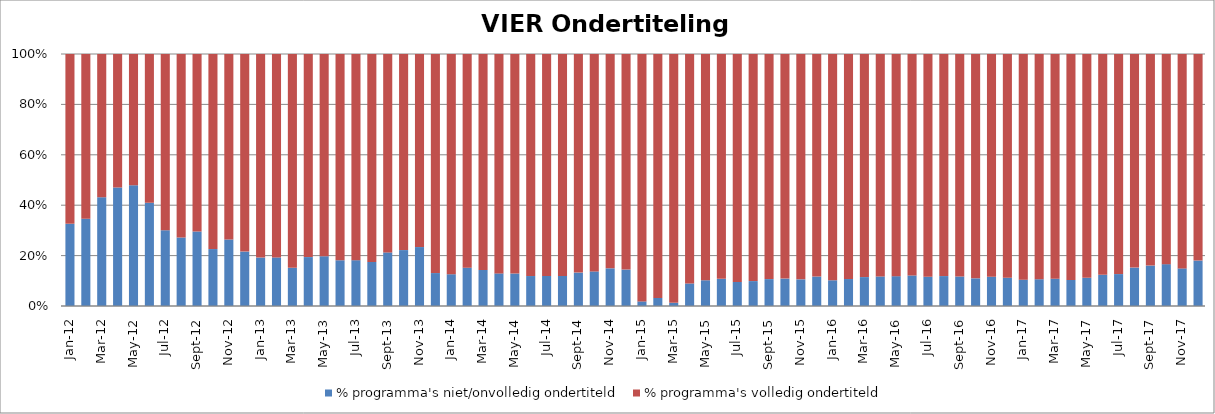
| Category | % programma's niet/onvolledig ondertiteld | % programma's volledig ondertiteld |
|---|---|---|
| 2012-01-01 | 0.326 | 0.674 |
| 2012-02-01 | 0.347 | 0.653 |
| 2012-03-01 | 0.432 | 0.568 |
| 2012-04-01 | 0.47 | 0.53 |
| 2012-05-01 | 0.48 | 0.52 |
| 2012-06-01 | 0.41 | 0.59 |
| 2012-07-01 | 0.301 | 0.699 |
| 2012-08-01 | 0.272 | 0.728 |
| 2012-09-01 | 0.296 | 0.704 |
| 2012-10-01 | 0.226 | 0.774 |
| 2012-11-01 | 0.264 | 0.736 |
| 2012-12-01 | 0.216 | 0.784 |
| 2013-01-01 | 0.192 | 0.808 |
| 2013-02-01 | 0.193 | 0.807 |
| 2013-03-01 | 0.151 | 0.849 |
| 2013-04-01 | 0.194 | 0.806 |
| 2013-05-01 | 0.197 | 0.803 |
| 2013-06-01 | 0.182 | 0.818 |
| 2013-07-01 | 0.182 | 0.818 |
| 2013-08-01 | 0.175 | 0.825 |
| 2013-09-01 | 0.213 | 0.787 |
| 2013-10-01 | 0.222 | 0.778 |
| 2013-11-01 | 0.234 | 0.766 |
| 2013-12-01 | 0.131 | 0.869 |
| 2014-01-01 | 0.126 | 0.874 |
| 2014-02-01 | 0.152 | 0.848 |
| 2014-03-01 | 0.143 | 0.857 |
| 2014-04-01 | 0.129 | 0.871 |
| 2014-05-01 | 0.129 | 0.871 |
| 2014-06-01 | 0.119 | 0.881 |
| 2014-07-01 | 0.12 | 0.88 |
| 2014-08-01 | 0.119 | 0.881 |
| 2014-09-01 | 0.132 | 0.868 |
| 2014-10-01 | 0.137 | 0.863 |
| 2014-11-01 | 0.15 | 0.85 |
| 2014-12-01 | 0.145 | 0.855 |
| 2015-01-01 | 0.018 | 0.982 |
| 2015-02-01 | 0.032 | 0.968 |
| 2015-03-01 | 0.012 | 0.988 |
| 2015-04-01 | 0.089 | 0.911 |
| 2015-05-01 | 0.102 | 0.898 |
| 2015-06-01 | 0.108 | 0.892 |
| 2015-07-01 | 0.095 | 0.905 |
| 2015-08-01 | 0.099 | 0.901 |
| 2015-09-01 | 0.107 | 0.893 |
| 2015-10-01 | 0.109 | 0.891 |
| 2015-11-01 | 0.106 | 0.894 |
| 2015-12-01 | 0.117 | 0.883 |
| 2016-01-01 | 0.102 | 0.898 |
| 2016-02-01 | 0.107 | 0.893 |
| 2016-03-01 | 0.115 | 0.885 |
| 2016-04-01 | 0.117 | 0.883 |
| 2016-05-01 | 0.118 | 0.882 |
| 2016-06-01 | 0.121 | 0.879 |
| 2016-07-01 | 0.116 | 0.884 |
| 2016-08-01 | 0.119 | 0.881 |
| 2016-09-01 | 0.117 | 0.883 |
| 2016-10-01 | 0.11 | 0.89 |
| 2016-11-01 | 0.116 | 0.884 |
| 2016-12-01 | 0.112 | 0.888 |
| 2017-01-01 | 0.105 | 0.895 |
| 2017-02-01 | 0.106 | 0.894 |
| 2017-03-01 | 0.108 | 0.892 |
| 2017-04-01 | 0.103 | 0.897 |
| 2017-05-01 | 0.112 | 0.888 |
| 2017-06-01 | 0.124 | 0.876 |
| 2017-07-01 | 0.127 | 0.873 |
| 2017-08-01 | 0.152 | 0.848 |
| 2017-09-01 | 0.16 | 0.84 |
| 2017-10-01 | 0.166 | 0.834 |
| 2017-11-01 | 0.149 | 0.851 |
| 2017-12-01 | 0.18 | 0.82 |